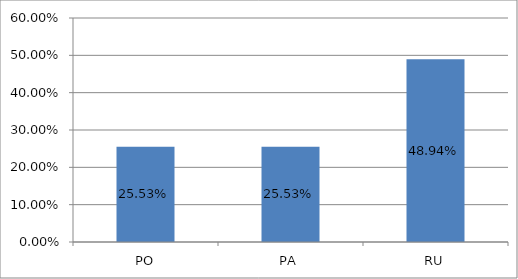
| Category | Series 0 |
|---|---|
| PO | 0.255 |
| PA | 0.255 |
| RU | 0.489 |